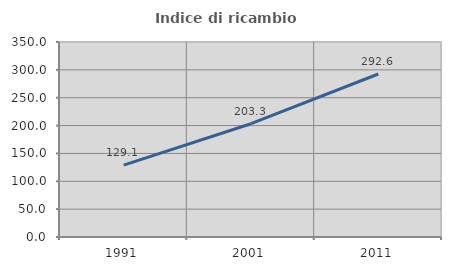
| Category | Indice di ricambio occupazionale  |
|---|---|
| 1991.0 | 129.074 |
| 2001.0 | 203.321 |
| 2011.0 | 292.593 |